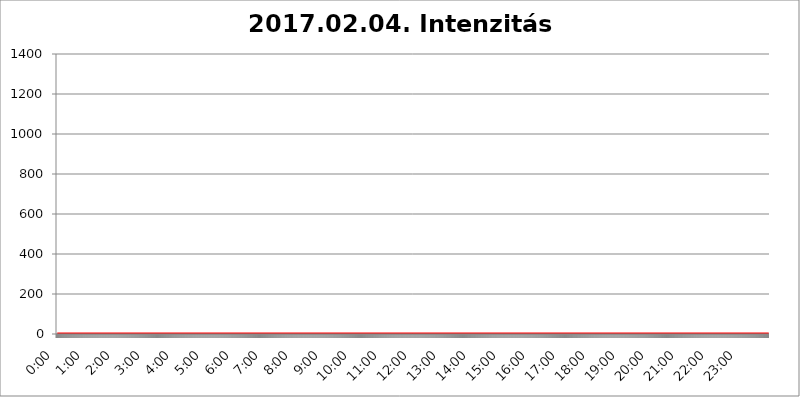
| Category | 2017.02.04. Intenzitás [W/m^2] |
|---|---|
| 0.0 | 0 |
| 0.0006944444444444445 | 0 |
| 0.001388888888888889 | 0 |
| 0.0020833333333333333 | 0 |
| 0.002777777777777778 | 0 |
| 0.003472222222222222 | 0 |
| 0.004166666666666667 | 0 |
| 0.004861111111111111 | 0 |
| 0.005555555555555556 | 0 |
| 0.0062499999999999995 | 0 |
| 0.006944444444444444 | 0 |
| 0.007638888888888889 | 0 |
| 0.008333333333333333 | 0 |
| 0.009027777777777779 | 0 |
| 0.009722222222222222 | 0 |
| 0.010416666666666666 | 0 |
| 0.011111111111111112 | 0 |
| 0.011805555555555555 | 0 |
| 0.012499999999999999 | 0 |
| 0.013194444444444444 | 0 |
| 0.013888888888888888 | 0 |
| 0.014583333333333332 | 0 |
| 0.015277777777777777 | 0 |
| 0.015972222222222224 | 0 |
| 0.016666666666666666 | 0 |
| 0.017361111111111112 | 0 |
| 0.018055555555555557 | 0 |
| 0.01875 | 0 |
| 0.019444444444444445 | 0 |
| 0.02013888888888889 | 0 |
| 0.020833333333333332 | 0 |
| 0.02152777777777778 | 0 |
| 0.022222222222222223 | 0 |
| 0.02291666666666667 | 0 |
| 0.02361111111111111 | 0 |
| 0.024305555555555556 | 0 |
| 0.024999999999999998 | 0 |
| 0.025694444444444447 | 0 |
| 0.02638888888888889 | 0 |
| 0.027083333333333334 | 0 |
| 0.027777777777777776 | 0 |
| 0.02847222222222222 | 0 |
| 0.029166666666666664 | 0 |
| 0.029861111111111113 | 0 |
| 0.030555555555555555 | 0 |
| 0.03125 | 0 |
| 0.03194444444444445 | 0 |
| 0.03263888888888889 | 0 |
| 0.03333333333333333 | 0 |
| 0.034027777777777775 | 0 |
| 0.034722222222222224 | 0 |
| 0.035416666666666666 | 0 |
| 0.036111111111111115 | 0 |
| 0.03680555555555556 | 0 |
| 0.0375 | 0 |
| 0.03819444444444444 | 0 |
| 0.03888888888888889 | 0 |
| 0.03958333333333333 | 0 |
| 0.04027777777777778 | 0 |
| 0.04097222222222222 | 0 |
| 0.041666666666666664 | 0 |
| 0.042361111111111106 | 0 |
| 0.04305555555555556 | 0 |
| 0.043750000000000004 | 0 |
| 0.044444444444444446 | 0 |
| 0.04513888888888889 | 0 |
| 0.04583333333333334 | 0 |
| 0.04652777777777778 | 0 |
| 0.04722222222222222 | 0 |
| 0.04791666666666666 | 0 |
| 0.04861111111111111 | 0 |
| 0.049305555555555554 | 0 |
| 0.049999999999999996 | 0 |
| 0.05069444444444445 | 0 |
| 0.051388888888888894 | 0 |
| 0.052083333333333336 | 0 |
| 0.05277777777777778 | 0 |
| 0.05347222222222222 | 0 |
| 0.05416666666666667 | 0 |
| 0.05486111111111111 | 0 |
| 0.05555555555555555 | 0 |
| 0.05625 | 0 |
| 0.05694444444444444 | 0 |
| 0.057638888888888885 | 0 |
| 0.05833333333333333 | 0 |
| 0.05902777777777778 | 0 |
| 0.059722222222222225 | 0 |
| 0.06041666666666667 | 0 |
| 0.061111111111111116 | 0 |
| 0.06180555555555556 | 0 |
| 0.0625 | 0 |
| 0.06319444444444444 | 0 |
| 0.06388888888888888 | 0 |
| 0.06458333333333334 | 0 |
| 0.06527777777777778 | 0 |
| 0.06597222222222222 | 0 |
| 0.06666666666666667 | 0 |
| 0.06736111111111111 | 0 |
| 0.06805555555555555 | 0 |
| 0.06874999999999999 | 0 |
| 0.06944444444444443 | 0 |
| 0.07013888888888889 | 0 |
| 0.07083333333333333 | 0 |
| 0.07152777777777779 | 0 |
| 0.07222222222222223 | 0 |
| 0.07291666666666667 | 0 |
| 0.07361111111111111 | 0 |
| 0.07430555555555556 | 0 |
| 0.075 | 0 |
| 0.07569444444444444 | 0 |
| 0.0763888888888889 | 0 |
| 0.07708333333333334 | 0 |
| 0.07777777777777778 | 0 |
| 0.07847222222222222 | 0 |
| 0.07916666666666666 | 0 |
| 0.0798611111111111 | 0 |
| 0.08055555555555556 | 0 |
| 0.08125 | 0 |
| 0.08194444444444444 | 0 |
| 0.08263888888888889 | 0 |
| 0.08333333333333333 | 0 |
| 0.08402777777777777 | 0 |
| 0.08472222222222221 | 0 |
| 0.08541666666666665 | 0 |
| 0.08611111111111112 | 0 |
| 0.08680555555555557 | 0 |
| 0.08750000000000001 | 0 |
| 0.08819444444444445 | 0 |
| 0.08888888888888889 | 0 |
| 0.08958333333333333 | 0 |
| 0.09027777777777778 | 0 |
| 0.09097222222222222 | 0 |
| 0.09166666666666667 | 0 |
| 0.09236111111111112 | 0 |
| 0.09305555555555556 | 0 |
| 0.09375 | 0 |
| 0.09444444444444444 | 0 |
| 0.09513888888888888 | 0 |
| 0.09583333333333333 | 0 |
| 0.09652777777777777 | 0 |
| 0.09722222222222222 | 0 |
| 0.09791666666666667 | 0 |
| 0.09861111111111111 | 0 |
| 0.09930555555555555 | 0 |
| 0.09999999999999999 | 0 |
| 0.10069444444444443 | 0 |
| 0.1013888888888889 | 0 |
| 0.10208333333333335 | 0 |
| 0.10277777777777779 | 0 |
| 0.10347222222222223 | 0 |
| 0.10416666666666667 | 0 |
| 0.10486111111111111 | 0 |
| 0.10555555555555556 | 0 |
| 0.10625 | 0 |
| 0.10694444444444444 | 0 |
| 0.1076388888888889 | 0 |
| 0.10833333333333334 | 0 |
| 0.10902777777777778 | 0 |
| 0.10972222222222222 | 0 |
| 0.1111111111111111 | 0 |
| 0.11180555555555556 | 0 |
| 0.11180555555555556 | 0 |
| 0.1125 | 0 |
| 0.11319444444444444 | 0 |
| 0.11388888888888889 | 0 |
| 0.11458333333333333 | 0 |
| 0.11527777777777777 | 0 |
| 0.11597222222222221 | 0 |
| 0.11666666666666665 | 0 |
| 0.1173611111111111 | 0 |
| 0.11805555555555557 | 0 |
| 0.11944444444444445 | 0 |
| 0.12013888888888889 | 0 |
| 0.12083333333333333 | 0 |
| 0.12152777777777778 | 0 |
| 0.12222222222222223 | 0 |
| 0.12291666666666667 | 0 |
| 0.12291666666666667 | 0 |
| 0.12361111111111112 | 0 |
| 0.12430555555555556 | 0 |
| 0.125 | 0 |
| 0.12569444444444444 | 0 |
| 0.12638888888888888 | 0 |
| 0.12708333333333333 | 0 |
| 0.16875 | 0 |
| 0.12847222222222224 | 0 |
| 0.12916666666666668 | 0 |
| 0.12986111111111112 | 0 |
| 0.13055555555555556 | 0 |
| 0.13125 | 0 |
| 0.13194444444444445 | 0 |
| 0.1326388888888889 | 0 |
| 0.13333333333333333 | 0 |
| 0.13402777777777777 | 0 |
| 0.13402777777777777 | 0 |
| 0.13472222222222222 | 0 |
| 0.13541666666666666 | 0 |
| 0.1361111111111111 | 0 |
| 0.13749999999999998 | 0 |
| 0.13819444444444443 | 0 |
| 0.1388888888888889 | 0 |
| 0.13958333333333334 | 0 |
| 0.14027777777777778 | 0 |
| 0.14097222222222222 | 0 |
| 0.14166666666666666 | 0 |
| 0.1423611111111111 | 0 |
| 0.14305555555555557 | 0 |
| 0.14375000000000002 | 0 |
| 0.14444444444444446 | 0 |
| 0.1451388888888889 | 0 |
| 0.1451388888888889 | 0 |
| 0.14652777777777778 | 0 |
| 0.14722222222222223 | 0 |
| 0.14791666666666667 | 0 |
| 0.1486111111111111 | 0 |
| 0.14930555555555555 | 0 |
| 0.15 | 0 |
| 0.15069444444444444 | 0 |
| 0.15138888888888888 | 0 |
| 0.15208333333333332 | 0 |
| 0.15277777777777776 | 0 |
| 0.15347222222222223 | 0 |
| 0.15416666666666667 | 0 |
| 0.15486111111111112 | 0 |
| 0.15555555555555556 | 0 |
| 0.15625 | 0 |
| 0.15694444444444444 | 0 |
| 0.15763888888888888 | 0 |
| 0.15833333333333333 | 0 |
| 0.15902777777777777 | 0 |
| 0.15972222222222224 | 0 |
| 0.16041666666666668 | 0 |
| 0.16111111111111112 | 0 |
| 0.16180555555555556 | 0 |
| 0.1625 | 0 |
| 0.16319444444444445 | 0 |
| 0.1638888888888889 | 0 |
| 0.16458333333333333 | 0 |
| 0.16527777777777777 | 0 |
| 0.16597222222222222 | 0 |
| 0.16666666666666666 | 0 |
| 0.1673611111111111 | 0 |
| 0.16805555555555554 | 0 |
| 0.16874999999999998 | 0 |
| 0.16944444444444443 | 0 |
| 0.17013888888888887 | 0 |
| 0.1708333333333333 | 0 |
| 0.17152777777777775 | 0 |
| 0.17222222222222225 | 0 |
| 0.1729166666666667 | 0 |
| 0.17361111111111113 | 0 |
| 0.17430555555555557 | 0 |
| 0.17500000000000002 | 0 |
| 0.17569444444444446 | 0 |
| 0.1763888888888889 | 0 |
| 0.17708333333333334 | 0 |
| 0.17777777777777778 | 0 |
| 0.17847222222222223 | 0 |
| 0.17916666666666667 | 0 |
| 0.1798611111111111 | 0 |
| 0.18055555555555555 | 0 |
| 0.18125 | 0 |
| 0.18194444444444444 | 0 |
| 0.1826388888888889 | 0 |
| 0.18333333333333335 | 0 |
| 0.1840277777777778 | 0 |
| 0.18472222222222223 | 0 |
| 0.18541666666666667 | 0 |
| 0.18611111111111112 | 0 |
| 0.18680555555555556 | 0 |
| 0.1875 | 0 |
| 0.18819444444444444 | 0 |
| 0.18888888888888888 | 0 |
| 0.18958333333333333 | 0 |
| 0.19027777777777777 | 0 |
| 0.1909722222222222 | 0 |
| 0.19166666666666665 | 0 |
| 0.19236111111111112 | 0 |
| 0.19305555555555554 | 0 |
| 0.19375 | 0 |
| 0.19444444444444445 | 0 |
| 0.1951388888888889 | 0 |
| 0.19583333333333333 | 0 |
| 0.19652777777777777 | 0 |
| 0.19722222222222222 | 0 |
| 0.19791666666666666 | 0 |
| 0.1986111111111111 | 0 |
| 0.19930555555555554 | 0 |
| 0.19999999999999998 | 0 |
| 0.20069444444444443 | 0 |
| 0.20138888888888887 | 0 |
| 0.2020833333333333 | 0 |
| 0.2027777777777778 | 0 |
| 0.2034722222222222 | 0 |
| 0.2041666666666667 | 0 |
| 0.20486111111111113 | 0 |
| 0.20555555555555557 | 0 |
| 0.20625000000000002 | 0 |
| 0.20694444444444446 | 0 |
| 0.2076388888888889 | 0 |
| 0.20833333333333334 | 0 |
| 0.20902777777777778 | 0 |
| 0.20972222222222223 | 0 |
| 0.21041666666666667 | 0 |
| 0.2111111111111111 | 0 |
| 0.21180555555555555 | 0 |
| 0.2125 | 0 |
| 0.21319444444444444 | 0 |
| 0.2138888888888889 | 0 |
| 0.21458333333333335 | 0 |
| 0.2152777777777778 | 0 |
| 0.21597222222222223 | 0 |
| 0.21666666666666667 | 0 |
| 0.21736111111111112 | 0 |
| 0.21805555555555556 | 0 |
| 0.21875 | 0 |
| 0.21944444444444444 | 0 |
| 0.22013888888888888 | 0 |
| 0.22083333333333333 | 0 |
| 0.22152777777777777 | 0 |
| 0.2222222222222222 | 0 |
| 0.22291666666666665 | 0 |
| 0.2236111111111111 | 0 |
| 0.22430555555555556 | 0 |
| 0.225 | 0 |
| 0.22569444444444445 | 0 |
| 0.2263888888888889 | 0 |
| 0.22708333333333333 | 0 |
| 0.22777777777777777 | 0 |
| 0.22847222222222222 | 0 |
| 0.22916666666666666 | 0 |
| 0.2298611111111111 | 0 |
| 0.23055555555555554 | 0 |
| 0.23124999999999998 | 0 |
| 0.23194444444444443 | 0 |
| 0.23263888888888887 | 0 |
| 0.2333333333333333 | 0 |
| 0.2340277777777778 | 0 |
| 0.2347222222222222 | 0 |
| 0.2354166666666667 | 0 |
| 0.23611111111111113 | 0 |
| 0.23680555555555557 | 0 |
| 0.23750000000000002 | 0 |
| 0.23819444444444446 | 0 |
| 0.2388888888888889 | 0 |
| 0.23958333333333334 | 0 |
| 0.24027777777777778 | 0 |
| 0.24097222222222223 | 0 |
| 0.24166666666666667 | 0 |
| 0.2423611111111111 | 0 |
| 0.24305555555555555 | 0 |
| 0.24375 | 0 |
| 0.24444444444444446 | 0 |
| 0.24513888888888888 | 0 |
| 0.24583333333333335 | 0 |
| 0.2465277777777778 | 0 |
| 0.24722222222222223 | 0 |
| 0.24791666666666667 | 0 |
| 0.24861111111111112 | 0 |
| 0.24930555555555556 | 0 |
| 0.25 | 0 |
| 0.25069444444444444 | 0 |
| 0.2513888888888889 | 0 |
| 0.2520833333333333 | 0 |
| 0.25277777777777777 | 0 |
| 0.2534722222222222 | 0 |
| 0.25416666666666665 | 0 |
| 0.2548611111111111 | 0 |
| 0.2555555555555556 | 0 |
| 0.25625000000000003 | 0 |
| 0.2569444444444445 | 0 |
| 0.2576388888888889 | 0 |
| 0.25833333333333336 | 0 |
| 0.2590277777777778 | 0 |
| 0.25972222222222224 | 0 |
| 0.2604166666666667 | 0 |
| 0.2611111111111111 | 0 |
| 0.26180555555555557 | 0 |
| 0.2625 | 0 |
| 0.26319444444444445 | 0 |
| 0.2638888888888889 | 0 |
| 0.26458333333333334 | 0 |
| 0.2652777777777778 | 0 |
| 0.2659722222222222 | 0 |
| 0.26666666666666666 | 0 |
| 0.2673611111111111 | 0 |
| 0.26805555555555555 | 0 |
| 0.26875 | 0 |
| 0.26944444444444443 | 0 |
| 0.2701388888888889 | 0 |
| 0.2708333333333333 | 0 |
| 0.27152777777777776 | 0 |
| 0.2722222222222222 | 0 |
| 0.27291666666666664 | 0 |
| 0.2736111111111111 | 0 |
| 0.2743055555555555 | 0 |
| 0.27499999999999997 | 0 |
| 0.27569444444444446 | 0 |
| 0.27638888888888885 | 0 |
| 0.27708333333333335 | 0 |
| 0.2777777777777778 | 0 |
| 0.27847222222222223 | 0 |
| 0.2791666666666667 | 0 |
| 0.2798611111111111 | 0 |
| 0.28055555555555556 | 0 |
| 0.28125 | 0 |
| 0.28194444444444444 | 0 |
| 0.2826388888888889 | 0 |
| 0.2833333333333333 | 0 |
| 0.28402777777777777 | 0 |
| 0.2847222222222222 | 0 |
| 0.28541666666666665 | 0 |
| 0.28611111111111115 | 0 |
| 0.28680555555555554 | 0 |
| 0.28750000000000003 | 0 |
| 0.2881944444444445 | 0 |
| 0.2888888888888889 | 0 |
| 0.28958333333333336 | 0 |
| 0.2902777777777778 | 0 |
| 0.29097222222222224 | 0 |
| 0.2916666666666667 | 0 |
| 0.2923611111111111 | 0 |
| 0.29305555555555557 | 0 |
| 0.29375 | 0 |
| 0.29444444444444445 | 0 |
| 0.2951388888888889 | 0 |
| 0.29583333333333334 | 0 |
| 0.2965277777777778 | 0 |
| 0.2972222222222222 | 0 |
| 0.29791666666666666 | 0 |
| 0.2986111111111111 | 0 |
| 0.29930555555555555 | 0 |
| 0.3 | 0 |
| 0.30069444444444443 | 0 |
| 0.3013888888888889 | 0 |
| 0.3020833333333333 | 0 |
| 0.30277777777777776 | 0 |
| 0.3034722222222222 | 0 |
| 0.30416666666666664 | 0 |
| 0.3048611111111111 | 0 |
| 0.3055555555555555 | 0 |
| 0.30624999999999997 | 0 |
| 0.3069444444444444 | 0 |
| 0.3076388888888889 | 0 |
| 0.30833333333333335 | 0 |
| 0.3090277777777778 | 0 |
| 0.30972222222222223 | 0 |
| 0.3104166666666667 | 0 |
| 0.3111111111111111 | 0 |
| 0.31180555555555556 | 0 |
| 0.3125 | 0 |
| 0.31319444444444444 | 0 |
| 0.3138888888888889 | 0 |
| 0.3145833333333333 | 0 |
| 0.31527777777777777 | 0 |
| 0.3159722222222222 | 0 |
| 0.31666666666666665 | 0 |
| 0.31736111111111115 | 0 |
| 0.31805555555555554 | 0 |
| 0.31875000000000003 | 0 |
| 0.3194444444444445 | 0 |
| 0.3201388888888889 | 0 |
| 0.32083333333333336 | 0 |
| 0.3215277777777778 | 0 |
| 0.32222222222222224 | 0 |
| 0.3229166666666667 | 0 |
| 0.3236111111111111 | 0 |
| 0.32430555555555557 | 0 |
| 0.325 | 0 |
| 0.32569444444444445 | 0 |
| 0.3263888888888889 | 0 |
| 0.32708333333333334 | 0 |
| 0.3277777777777778 | 0 |
| 0.3284722222222222 | 0 |
| 0.32916666666666666 | 0 |
| 0.3298611111111111 | 0 |
| 0.33055555555555555 | 0 |
| 0.33125 | 0 |
| 0.33194444444444443 | 0 |
| 0.3326388888888889 | 0 |
| 0.3333333333333333 | 0 |
| 0.3340277777777778 | 0 |
| 0.3347222222222222 | 0 |
| 0.3354166666666667 | 0 |
| 0.3361111111111111 | 0 |
| 0.3368055555555556 | 0 |
| 0.33749999999999997 | 0 |
| 0.33819444444444446 | 0 |
| 0.33888888888888885 | 0 |
| 0.33958333333333335 | 0 |
| 0.34027777777777773 | 0 |
| 0.34097222222222223 | 0 |
| 0.3416666666666666 | 0 |
| 0.3423611111111111 | 0 |
| 0.3430555555555555 | 0 |
| 0.34375 | 0 |
| 0.3444444444444445 | 0 |
| 0.3451388888888889 | 0 |
| 0.3458333333333334 | 0 |
| 0.34652777777777777 | 0 |
| 0.34722222222222227 | 0 |
| 0.34791666666666665 | 0 |
| 0.34861111111111115 | 0 |
| 0.34930555555555554 | 0 |
| 0.35000000000000003 | 0 |
| 0.3506944444444444 | 0 |
| 0.3513888888888889 | 0 |
| 0.3520833333333333 | 0 |
| 0.3527777777777778 | 0 |
| 0.3534722222222222 | 0 |
| 0.3541666666666667 | 0 |
| 0.3548611111111111 | 0 |
| 0.35555555555555557 | 0 |
| 0.35625 | 0 |
| 0.35694444444444445 | 0 |
| 0.3576388888888889 | 0 |
| 0.35833333333333334 | 0 |
| 0.3590277777777778 | 0 |
| 0.3597222222222222 | 0 |
| 0.36041666666666666 | 0 |
| 0.3611111111111111 | 0 |
| 0.36180555555555555 | 0 |
| 0.3625 | 0 |
| 0.36319444444444443 | 0 |
| 0.3638888888888889 | 0 |
| 0.3645833333333333 | 0 |
| 0.3652777777777778 | 0 |
| 0.3659722222222222 | 0 |
| 0.3666666666666667 | 0 |
| 0.3673611111111111 | 0 |
| 0.3680555555555556 | 0 |
| 0.36874999999999997 | 0 |
| 0.36944444444444446 | 0 |
| 0.37013888888888885 | 0 |
| 0.37083333333333335 | 0 |
| 0.37152777777777773 | 0 |
| 0.37222222222222223 | 0 |
| 0.3729166666666666 | 0 |
| 0.3736111111111111 | 0 |
| 0.3743055555555555 | 0 |
| 0.375 | 0 |
| 0.3756944444444445 | 0 |
| 0.3763888888888889 | 0 |
| 0.3770833333333334 | 0 |
| 0.37777777777777777 | 0 |
| 0.37847222222222227 | 0 |
| 0.37916666666666665 | 0 |
| 0.37986111111111115 | 0 |
| 0.38055555555555554 | 0 |
| 0.38125000000000003 | 0 |
| 0.3819444444444444 | 0 |
| 0.3826388888888889 | 0 |
| 0.3833333333333333 | 0 |
| 0.3840277777777778 | 0 |
| 0.3847222222222222 | 0 |
| 0.3854166666666667 | 0 |
| 0.3861111111111111 | 0 |
| 0.38680555555555557 | 0 |
| 0.3875 | 0 |
| 0.38819444444444445 | 0 |
| 0.3888888888888889 | 0 |
| 0.38958333333333334 | 0 |
| 0.3902777777777778 | 0 |
| 0.3909722222222222 | 0 |
| 0.39166666666666666 | 0 |
| 0.3923611111111111 | 0 |
| 0.39305555555555555 | 0 |
| 0.39375 | 0 |
| 0.39444444444444443 | 0 |
| 0.3951388888888889 | 0 |
| 0.3958333333333333 | 0 |
| 0.3965277777777778 | 0 |
| 0.3972222222222222 | 0 |
| 0.3979166666666667 | 0 |
| 0.3986111111111111 | 0 |
| 0.3993055555555556 | 0 |
| 0.39999999999999997 | 0 |
| 0.40069444444444446 | 0 |
| 0.40138888888888885 | 0 |
| 0.40208333333333335 | 0 |
| 0.40277777777777773 | 0 |
| 0.40347222222222223 | 0 |
| 0.4041666666666666 | 0 |
| 0.4048611111111111 | 0 |
| 0.4055555555555555 | 0 |
| 0.40625 | 0 |
| 0.4069444444444445 | 0 |
| 0.4076388888888889 | 0 |
| 0.4083333333333334 | 0 |
| 0.40902777777777777 | 0 |
| 0.40972222222222227 | 0 |
| 0.41041666666666665 | 0 |
| 0.41111111111111115 | 0 |
| 0.41180555555555554 | 0 |
| 0.41250000000000003 | 0 |
| 0.4131944444444444 | 0 |
| 0.4138888888888889 | 0 |
| 0.4145833333333333 | 0 |
| 0.4152777777777778 | 0 |
| 0.4159722222222222 | 0 |
| 0.4166666666666667 | 0 |
| 0.4173611111111111 | 0 |
| 0.41805555555555557 | 0 |
| 0.41875 | 0 |
| 0.41944444444444445 | 0 |
| 0.4201388888888889 | 0 |
| 0.42083333333333334 | 0 |
| 0.4215277777777778 | 0 |
| 0.4222222222222222 | 0 |
| 0.42291666666666666 | 0 |
| 0.4236111111111111 | 0 |
| 0.42430555555555555 | 0 |
| 0.425 | 0 |
| 0.42569444444444443 | 0 |
| 0.4263888888888889 | 0 |
| 0.4270833333333333 | 0 |
| 0.4277777777777778 | 0 |
| 0.4284722222222222 | 0 |
| 0.4291666666666667 | 0 |
| 0.4298611111111111 | 0 |
| 0.4305555555555556 | 0 |
| 0.43124999999999997 | 0 |
| 0.43194444444444446 | 0 |
| 0.43263888888888885 | 0 |
| 0.43333333333333335 | 0 |
| 0.43402777777777773 | 0 |
| 0.43472222222222223 | 0 |
| 0.4354166666666666 | 0 |
| 0.4361111111111111 | 0 |
| 0.4368055555555555 | 0 |
| 0.4375 | 0 |
| 0.4381944444444445 | 0 |
| 0.4388888888888889 | 0 |
| 0.4395833333333334 | 0 |
| 0.44027777777777777 | 0 |
| 0.44097222222222227 | 0 |
| 0.44166666666666665 | 0 |
| 0.44236111111111115 | 0 |
| 0.44305555555555554 | 0 |
| 0.44375000000000003 | 0 |
| 0.4444444444444444 | 0 |
| 0.4451388888888889 | 0 |
| 0.4458333333333333 | 0 |
| 0.4465277777777778 | 0 |
| 0.4472222222222222 | 0 |
| 0.4479166666666667 | 0 |
| 0.4486111111111111 | 0 |
| 0.44930555555555557 | 0 |
| 0.45 | 0 |
| 0.45069444444444445 | 0 |
| 0.4513888888888889 | 0 |
| 0.45208333333333334 | 0 |
| 0.4527777777777778 | 0 |
| 0.4534722222222222 | 0 |
| 0.45416666666666666 | 0 |
| 0.4548611111111111 | 0 |
| 0.45555555555555555 | 0 |
| 0.45625 | 0 |
| 0.45694444444444443 | 0 |
| 0.4576388888888889 | 0 |
| 0.4583333333333333 | 0 |
| 0.4590277777777778 | 0 |
| 0.4597222222222222 | 0 |
| 0.4604166666666667 | 0 |
| 0.4611111111111111 | 0 |
| 0.4618055555555556 | 0 |
| 0.46249999999999997 | 0 |
| 0.46319444444444446 | 0 |
| 0.46388888888888885 | 0 |
| 0.46458333333333335 | 0 |
| 0.46527777777777773 | 0 |
| 0.46597222222222223 | 0 |
| 0.4666666666666666 | 0 |
| 0.4673611111111111 | 0 |
| 0.4680555555555555 | 0 |
| 0.46875 | 0 |
| 0.4694444444444445 | 0 |
| 0.4701388888888889 | 0 |
| 0.4708333333333334 | 0 |
| 0.47152777777777777 | 0 |
| 0.47222222222222227 | 0 |
| 0.47291666666666665 | 0 |
| 0.47361111111111115 | 0 |
| 0.47430555555555554 | 0 |
| 0.47500000000000003 | 0 |
| 0.4756944444444444 | 0 |
| 0.4763888888888889 | 0 |
| 0.4770833333333333 | 0 |
| 0.4777777777777778 | 0 |
| 0.4784722222222222 | 0 |
| 0.4791666666666667 | 0 |
| 0.4798611111111111 | 0 |
| 0.48055555555555557 | 0 |
| 0.48125 | 0 |
| 0.48194444444444445 | 0 |
| 0.4826388888888889 | 0 |
| 0.48333333333333334 | 0 |
| 0.4840277777777778 | 0 |
| 0.4847222222222222 | 0 |
| 0.48541666666666666 | 0 |
| 0.4861111111111111 | 0 |
| 0.48680555555555555 | 0 |
| 0.4875 | 0 |
| 0.48819444444444443 | 0 |
| 0.4888888888888889 | 0 |
| 0.4895833333333333 | 0 |
| 0.4902777777777778 | 0 |
| 0.4909722222222222 | 0 |
| 0.4916666666666667 | 0 |
| 0.4923611111111111 | 0 |
| 0.4930555555555556 | 0 |
| 0.49374999999999997 | 0 |
| 0.49444444444444446 | 0 |
| 0.49513888888888885 | 0 |
| 0.49583333333333335 | 0 |
| 0.49652777777777773 | 0 |
| 0.49722222222222223 | 0 |
| 0.4979166666666666 | 0 |
| 0.4986111111111111 | 0 |
| 0.4993055555555555 | 0 |
| 0.5 | 0 |
| 0.5006944444444444 | 0 |
| 0.5013888888888889 | 0 |
| 0.5020833333333333 | 0 |
| 0.5027777777777778 | 0 |
| 0.5034722222222222 | 0 |
| 0.5041666666666667 | 0 |
| 0.5048611111111111 | 0 |
| 0.5055555555555555 | 0 |
| 0.50625 | 0 |
| 0.5069444444444444 | 0 |
| 0.5076388888888889 | 0 |
| 0.5083333333333333 | 0 |
| 0.5090277777777777 | 0 |
| 0.5097222222222222 | 0 |
| 0.5104166666666666 | 0 |
| 0.5111111111111112 | 0 |
| 0.5118055555555555 | 0 |
| 0.5125000000000001 | 0 |
| 0.5131944444444444 | 0 |
| 0.513888888888889 | 0 |
| 0.5145833333333333 | 0 |
| 0.5152777777777778 | 0 |
| 0.5159722222222222 | 0 |
| 0.5166666666666667 | 0 |
| 0.517361111111111 | 0 |
| 0.5180555555555556 | 0 |
| 0.5187499999999999 | 0 |
| 0.5194444444444445 | 0 |
| 0.5201388888888888 | 0 |
| 0.5208333333333334 | 0 |
| 0.5215277777777778 | 0 |
| 0.5222222222222223 | 0 |
| 0.5229166666666667 | 0 |
| 0.5236111111111111 | 0 |
| 0.5243055555555556 | 0 |
| 0.525 | 0 |
| 0.5256944444444445 | 0 |
| 0.5263888888888889 | 0 |
| 0.5270833333333333 | 0 |
| 0.5277777777777778 | 0 |
| 0.5284722222222222 | 0 |
| 0.5291666666666667 | 0 |
| 0.5298611111111111 | 0 |
| 0.5305555555555556 | 0 |
| 0.53125 | 0 |
| 0.5319444444444444 | 0 |
| 0.5326388888888889 | 0 |
| 0.5333333333333333 | 0 |
| 0.5340277777777778 | 0 |
| 0.5347222222222222 | 0 |
| 0.5354166666666667 | 0 |
| 0.5361111111111111 | 0 |
| 0.5368055555555555 | 0 |
| 0.5375 | 0 |
| 0.5381944444444444 | 0 |
| 0.5388888888888889 | 0 |
| 0.5395833333333333 | 0 |
| 0.5402777777777777 | 0 |
| 0.5409722222222222 | 0 |
| 0.5416666666666666 | 0 |
| 0.5423611111111112 | 0 |
| 0.5430555555555555 | 0 |
| 0.5437500000000001 | 0 |
| 0.5444444444444444 | 0 |
| 0.545138888888889 | 0 |
| 0.5458333333333333 | 0 |
| 0.5465277777777778 | 0 |
| 0.5472222222222222 | 0 |
| 0.5479166666666667 | 0 |
| 0.548611111111111 | 0 |
| 0.5493055555555556 | 0 |
| 0.5499999999999999 | 0 |
| 0.5506944444444445 | 0 |
| 0.5513888888888888 | 0 |
| 0.5520833333333334 | 0 |
| 0.5527777777777778 | 0 |
| 0.5534722222222223 | 0 |
| 0.5541666666666667 | 0 |
| 0.5548611111111111 | 0 |
| 0.5555555555555556 | 0 |
| 0.55625 | 0 |
| 0.5569444444444445 | 0 |
| 0.5576388888888889 | 0 |
| 0.5583333333333333 | 0 |
| 0.5590277777777778 | 0 |
| 0.5597222222222222 | 0 |
| 0.5604166666666667 | 0 |
| 0.5611111111111111 | 0 |
| 0.5618055555555556 | 0 |
| 0.5625 | 0 |
| 0.5631944444444444 | 0 |
| 0.5638888888888889 | 0 |
| 0.5645833333333333 | 0 |
| 0.5652777777777778 | 0 |
| 0.5659722222222222 | 0 |
| 0.5666666666666667 | 0 |
| 0.5673611111111111 | 0 |
| 0.5680555555555555 | 0 |
| 0.56875 | 0 |
| 0.5694444444444444 | 0 |
| 0.5701388888888889 | 0 |
| 0.5708333333333333 | 0 |
| 0.5715277777777777 | 0 |
| 0.5722222222222222 | 0 |
| 0.5729166666666666 | 0 |
| 0.5736111111111112 | 0 |
| 0.5743055555555555 | 0 |
| 0.5750000000000001 | 0 |
| 0.5756944444444444 | 0 |
| 0.576388888888889 | 0 |
| 0.5770833333333333 | 0 |
| 0.5777777777777778 | 0 |
| 0.5784722222222222 | 0 |
| 0.5791666666666667 | 0 |
| 0.579861111111111 | 0 |
| 0.5805555555555556 | 0 |
| 0.5812499999999999 | 0 |
| 0.5819444444444445 | 0 |
| 0.5826388888888888 | 0 |
| 0.5833333333333334 | 0 |
| 0.5840277777777778 | 0 |
| 0.5847222222222223 | 0 |
| 0.5854166666666667 | 0 |
| 0.5861111111111111 | 0 |
| 0.5868055555555556 | 0 |
| 0.5875 | 0 |
| 0.5881944444444445 | 0 |
| 0.5888888888888889 | 0 |
| 0.5895833333333333 | 0 |
| 0.5902777777777778 | 0 |
| 0.5909722222222222 | 0 |
| 0.5916666666666667 | 0 |
| 0.5923611111111111 | 0 |
| 0.5930555555555556 | 0 |
| 0.59375 | 0 |
| 0.5944444444444444 | 0 |
| 0.5951388888888889 | 0 |
| 0.5958333333333333 | 0 |
| 0.5965277777777778 | 0 |
| 0.5972222222222222 | 0 |
| 0.5979166666666667 | 0 |
| 0.5986111111111111 | 0 |
| 0.5993055555555555 | 0 |
| 0.6 | 0 |
| 0.6006944444444444 | 0 |
| 0.6013888888888889 | 0 |
| 0.6020833333333333 | 0 |
| 0.6027777777777777 | 0 |
| 0.6034722222222222 | 0 |
| 0.6041666666666666 | 0 |
| 0.6048611111111112 | 0 |
| 0.6055555555555555 | 0 |
| 0.6062500000000001 | 0 |
| 0.6069444444444444 | 0 |
| 0.607638888888889 | 0 |
| 0.6083333333333333 | 0 |
| 0.6090277777777778 | 0 |
| 0.6097222222222222 | 0 |
| 0.6104166666666667 | 0 |
| 0.611111111111111 | 0 |
| 0.6118055555555556 | 0 |
| 0.6124999999999999 | 0 |
| 0.6131944444444445 | 0 |
| 0.6138888888888888 | 0 |
| 0.6145833333333334 | 0 |
| 0.6152777777777778 | 0 |
| 0.6159722222222223 | 0 |
| 0.6166666666666667 | 0 |
| 0.6173611111111111 | 0 |
| 0.6180555555555556 | 0 |
| 0.61875 | 0 |
| 0.6194444444444445 | 0 |
| 0.6201388888888889 | 0 |
| 0.6208333333333333 | 0 |
| 0.6215277777777778 | 0 |
| 0.6222222222222222 | 0 |
| 0.6229166666666667 | 0 |
| 0.6236111111111111 | 0 |
| 0.6243055555555556 | 0 |
| 0.625 | 0 |
| 0.6256944444444444 | 0 |
| 0.6263888888888889 | 0 |
| 0.6270833333333333 | 0 |
| 0.6277777777777778 | 0 |
| 0.6284722222222222 | 0 |
| 0.6291666666666667 | 0 |
| 0.6298611111111111 | 0 |
| 0.6305555555555555 | 0 |
| 0.63125 | 0 |
| 0.6319444444444444 | 0 |
| 0.6326388888888889 | 0 |
| 0.6333333333333333 | 0 |
| 0.6340277777777777 | 0 |
| 0.6347222222222222 | 0 |
| 0.6354166666666666 | 0 |
| 0.6361111111111112 | 0 |
| 0.6368055555555555 | 0 |
| 0.6375000000000001 | 0 |
| 0.6381944444444444 | 0 |
| 0.638888888888889 | 0 |
| 0.6395833333333333 | 0 |
| 0.6402777777777778 | 0 |
| 0.6409722222222222 | 0 |
| 0.6416666666666667 | 0 |
| 0.642361111111111 | 0 |
| 0.6430555555555556 | 0 |
| 0.6437499999999999 | 0 |
| 0.6444444444444445 | 0 |
| 0.6451388888888888 | 0 |
| 0.6458333333333334 | 0 |
| 0.6465277777777778 | 0 |
| 0.6472222222222223 | 0 |
| 0.6479166666666667 | 0 |
| 0.6486111111111111 | 0 |
| 0.6493055555555556 | 0 |
| 0.65 | 0 |
| 0.6506944444444445 | 0 |
| 0.6513888888888889 | 0 |
| 0.6520833333333333 | 0 |
| 0.6527777777777778 | 0 |
| 0.6534722222222222 | 0 |
| 0.6541666666666667 | 0 |
| 0.6548611111111111 | 0 |
| 0.6555555555555556 | 0 |
| 0.65625 | 0 |
| 0.6569444444444444 | 0 |
| 0.6576388888888889 | 0 |
| 0.6583333333333333 | 0 |
| 0.6590277777777778 | 0 |
| 0.6597222222222222 | 0 |
| 0.6604166666666667 | 0 |
| 0.6611111111111111 | 0 |
| 0.6618055555555555 | 0 |
| 0.6625 | 0 |
| 0.6631944444444444 | 0 |
| 0.6638888888888889 | 0 |
| 0.6645833333333333 | 0 |
| 0.6652777777777777 | 0 |
| 0.6659722222222222 | 0 |
| 0.6666666666666666 | 0 |
| 0.6673611111111111 | 0 |
| 0.6680555555555556 | 0 |
| 0.6687500000000001 | 0 |
| 0.6694444444444444 | 0 |
| 0.6701388888888888 | 0 |
| 0.6708333333333334 | 0 |
| 0.6715277777777778 | 0 |
| 0.6722222222222222 | 0 |
| 0.6729166666666666 | 0 |
| 0.6736111111111112 | 0 |
| 0.6743055555555556 | 0 |
| 0.6749999999999999 | 0 |
| 0.6756944444444444 | 0 |
| 0.6763888888888889 | 0 |
| 0.6770833333333334 | 0 |
| 0.6777777777777777 | 0 |
| 0.6784722222222223 | 0 |
| 0.6791666666666667 | 0 |
| 0.6798611111111111 | 0 |
| 0.6805555555555555 | 0 |
| 0.68125 | 0 |
| 0.6819444444444445 | 0 |
| 0.6826388888888889 | 0 |
| 0.6833333333333332 | 0 |
| 0.6840277777777778 | 0 |
| 0.6847222222222222 | 0 |
| 0.6854166666666667 | 0 |
| 0.686111111111111 | 0 |
| 0.6868055555555556 | 0 |
| 0.6875 | 0 |
| 0.6881944444444444 | 0 |
| 0.688888888888889 | 0 |
| 0.6895833333333333 | 0 |
| 0.6902777777777778 | 0 |
| 0.6909722222222222 | 0 |
| 0.6916666666666668 | 0 |
| 0.6923611111111111 | 0 |
| 0.6930555555555555 | 0 |
| 0.69375 | 0 |
| 0.6944444444444445 | 0 |
| 0.6951388888888889 | 0 |
| 0.6958333333333333 | 0 |
| 0.6965277777777777 | 0 |
| 0.6972222222222223 | 0 |
| 0.6979166666666666 | 0 |
| 0.6986111111111111 | 0 |
| 0.6993055555555556 | 0 |
| 0.7000000000000001 | 0 |
| 0.7006944444444444 | 0 |
| 0.7013888888888888 | 0 |
| 0.7020833333333334 | 0 |
| 0.7027777777777778 | 0 |
| 0.7034722222222222 | 0 |
| 0.7041666666666666 | 0 |
| 0.7048611111111112 | 0 |
| 0.7055555555555556 | 0 |
| 0.7062499999999999 | 0 |
| 0.7069444444444444 | 0 |
| 0.7076388888888889 | 0 |
| 0.7083333333333334 | 0 |
| 0.7090277777777777 | 0 |
| 0.7097222222222223 | 0 |
| 0.7104166666666667 | 0 |
| 0.7111111111111111 | 0 |
| 0.7118055555555555 | 0 |
| 0.7125 | 0 |
| 0.7131944444444445 | 0 |
| 0.7138888888888889 | 0 |
| 0.7145833333333332 | 0 |
| 0.7152777777777778 | 0 |
| 0.7159722222222222 | 0 |
| 0.7166666666666667 | 0 |
| 0.717361111111111 | 0 |
| 0.7180555555555556 | 0 |
| 0.71875 | 0 |
| 0.7194444444444444 | 0 |
| 0.720138888888889 | 0 |
| 0.7208333333333333 | 0 |
| 0.7215277777777778 | 0 |
| 0.7222222222222222 | 0 |
| 0.7229166666666668 | 0 |
| 0.7236111111111111 | 0 |
| 0.7243055555555555 | 0 |
| 0.725 | 0 |
| 0.7256944444444445 | 0 |
| 0.7263888888888889 | 0 |
| 0.7270833333333333 | 0 |
| 0.7277777777777777 | 0 |
| 0.7284722222222223 | 0 |
| 0.7291666666666666 | 0 |
| 0.7298611111111111 | 0 |
| 0.7305555555555556 | 0 |
| 0.7312500000000001 | 0 |
| 0.7319444444444444 | 0 |
| 0.7326388888888888 | 0 |
| 0.7333333333333334 | 0 |
| 0.7340277777777778 | 0 |
| 0.7347222222222222 | 0 |
| 0.7354166666666666 | 0 |
| 0.7361111111111112 | 0 |
| 0.7368055555555556 | 0 |
| 0.7374999999999999 | 0 |
| 0.7381944444444444 | 0 |
| 0.7388888888888889 | 0 |
| 0.7395833333333334 | 0 |
| 0.7402777777777777 | 0 |
| 0.7409722222222223 | 0 |
| 0.7416666666666667 | 0 |
| 0.7423611111111111 | 0 |
| 0.7430555555555555 | 0 |
| 0.74375 | 0 |
| 0.7444444444444445 | 0 |
| 0.7451388888888889 | 0 |
| 0.7458333333333332 | 0 |
| 0.7465277777777778 | 0 |
| 0.7472222222222222 | 0 |
| 0.7479166666666667 | 0 |
| 0.748611111111111 | 0 |
| 0.7493055555555556 | 0 |
| 0.75 | 0 |
| 0.7506944444444444 | 0 |
| 0.751388888888889 | 0 |
| 0.7520833333333333 | 0 |
| 0.7527777777777778 | 0 |
| 0.7534722222222222 | 0 |
| 0.7541666666666668 | 0 |
| 0.7548611111111111 | 0 |
| 0.7555555555555555 | 0 |
| 0.75625 | 0 |
| 0.7569444444444445 | 0 |
| 0.7576388888888889 | 0 |
| 0.7583333333333333 | 0 |
| 0.7590277777777777 | 0 |
| 0.7597222222222223 | 0 |
| 0.7604166666666666 | 0 |
| 0.7611111111111111 | 0 |
| 0.7618055555555556 | 0 |
| 0.7625000000000001 | 0 |
| 0.7631944444444444 | 0 |
| 0.7638888888888888 | 0 |
| 0.7645833333333334 | 0 |
| 0.7652777777777778 | 0 |
| 0.7659722222222222 | 0 |
| 0.7666666666666666 | 0 |
| 0.7673611111111112 | 0 |
| 0.7680555555555556 | 0 |
| 0.7687499999999999 | 0 |
| 0.7694444444444444 | 0 |
| 0.7701388888888889 | 0 |
| 0.7708333333333334 | 0 |
| 0.7715277777777777 | 0 |
| 0.7722222222222223 | 0 |
| 0.7729166666666667 | 0 |
| 0.7736111111111111 | 0 |
| 0.7743055555555555 | 0 |
| 0.775 | 0 |
| 0.7756944444444445 | 0 |
| 0.7763888888888889 | 0 |
| 0.7770833333333332 | 0 |
| 0.7777777777777778 | 0 |
| 0.7784722222222222 | 0 |
| 0.7791666666666667 | 0 |
| 0.779861111111111 | 0 |
| 0.7805555555555556 | 0 |
| 0.78125 | 0 |
| 0.7819444444444444 | 0 |
| 0.782638888888889 | 0 |
| 0.7833333333333333 | 0 |
| 0.7840277777777778 | 0 |
| 0.7847222222222222 | 0 |
| 0.7854166666666668 | 0 |
| 0.7861111111111111 | 0 |
| 0.7868055555555555 | 0 |
| 0.7875 | 0 |
| 0.7881944444444445 | 0 |
| 0.7888888888888889 | 0 |
| 0.7895833333333333 | 0 |
| 0.7902777777777777 | 0 |
| 0.7909722222222223 | 0 |
| 0.7916666666666666 | 0 |
| 0.7923611111111111 | 0 |
| 0.7930555555555556 | 0 |
| 0.7937500000000001 | 0 |
| 0.7944444444444444 | 0 |
| 0.7951388888888888 | 0 |
| 0.7958333333333334 | 0 |
| 0.7965277777777778 | 0 |
| 0.7972222222222222 | 0 |
| 0.7979166666666666 | 0 |
| 0.7986111111111112 | 0 |
| 0.7993055555555556 | 0 |
| 0.7999999999999999 | 0 |
| 0.8006944444444444 | 0 |
| 0.8013888888888889 | 0 |
| 0.8020833333333334 | 0 |
| 0.8027777777777777 | 0 |
| 0.8034722222222223 | 0 |
| 0.8041666666666667 | 0 |
| 0.8048611111111111 | 0 |
| 0.8055555555555555 | 0 |
| 0.80625 | 0 |
| 0.8069444444444445 | 0 |
| 0.8076388888888889 | 0 |
| 0.8083333333333332 | 0 |
| 0.8090277777777778 | 0 |
| 0.8097222222222222 | 0 |
| 0.8104166666666667 | 0 |
| 0.811111111111111 | 0 |
| 0.8118055555555556 | 0 |
| 0.8125 | 0 |
| 0.8131944444444444 | 0 |
| 0.813888888888889 | 0 |
| 0.8145833333333333 | 0 |
| 0.8152777777777778 | 0 |
| 0.8159722222222222 | 0 |
| 0.8166666666666668 | 0 |
| 0.8173611111111111 | 0 |
| 0.8180555555555555 | 0 |
| 0.81875 | 0 |
| 0.8194444444444445 | 0 |
| 0.8201388888888889 | 0 |
| 0.8208333333333333 | 0 |
| 0.8215277777777777 | 0 |
| 0.8222222222222223 | 0 |
| 0.8229166666666666 | 0 |
| 0.8236111111111111 | 0 |
| 0.8243055555555556 | 0 |
| 0.8250000000000001 | 0 |
| 0.8256944444444444 | 0 |
| 0.8263888888888888 | 0 |
| 0.8270833333333334 | 0 |
| 0.8277777777777778 | 0 |
| 0.8284722222222222 | 0 |
| 0.8291666666666666 | 0 |
| 0.8298611111111112 | 0 |
| 0.8305555555555556 | 0 |
| 0.8312499999999999 | 0 |
| 0.8319444444444444 | 0 |
| 0.8326388888888889 | 0 |
| 0.8333333333333334 | 0 |
| 0.8340277777777777 | 0 |
| 0.8347222222222223 | 0 |
| 0.8354166666666667 | 0 |
| 0.8361111111111111 | 0 |
| 0.8368055555555555 | 0 |
| 0.8375 | 0 |
| 0.8381944444444445 | 0 |
| 0.8388888888888889 | 0 |
| 0.8395833333333332 | 0 |
| 0.8402777777777778 | 0 |
| 0.8409722222222222 | 0 |
| 0.8416666666666667 | 0 |
| 0.842361111111111 | 0 |
| 0.8430555555555556 | 0 |
| 0.84375 | 0 |
| 0.8444444444444444 | 0 |
| 0.845138888888889 | 0 |
| 0.8458333333333333 | 0 |
| 0.8465277777777778 | 0 |
| 0.8472222222222222 | 0 |
| 0.8479166666666668 | 0 |
| 0.8486111111111111 | 0 |
| 0.8493055555555555 | 0 |
| 0.85 | 0 |
| 0.8506944444444445 | 0 |
| 0.8513888888888889 | 0 |
| 0.8520833333333333 | 0 |
| 0.8527777777777777 | 0 |
| 0.8534722222222223 | 0 |
| 0.8541666666666666 | 0 |
| 0.8548611111111111 | 0 |
| 0.8555555555555556 | 0 |
| 0.8562500000000001 | 0 |
| 0.8569444444444444 | 0 |
| 0.8576388888888888 | 0 |
| 0.8583333333333334 | 0 |
| 0.8590277777777778 | 0 |
| 0.8597222222222222 | 0 |
| 0.8604166666666666 | 0 |
| 0.8611111111111112 | 0 |
| 0.8618055555555556 | 0 |
| 0.8624999999999999 | 0 |
| 0.8631944444444444 | 0 |
| 0.8638888888888889 | 0 |
| 0.8645833333333334 | 0 |
| 0.8652777777777777 | 0 |
| 0.8659722222222223 | 0 |
| 0.8666666666666667 | 0 |
| 0.8673611111111111 | 0 |
| 0.8680555555555555 | 0 |
| 0.86875 | 0 |
| 0.8694444444444445 | 0 |
| 0.8701388888888889 | 0 |
| 0.8708333333333332 | 0 |
| 0.8715277777777778 | 0 |
| 0.8722222222222222 | 0 |
| 0.8729166666666667 | 0 |
| 0.873611111111111 | 0 |
| 0.8743055555555556 | 0 |
| 0.875 | 0 |
| 0.8756944444444444 | 0 |
| 0.876388888888889 | 0 |
| 0.8770833333333333 | 0 |
| 0.8777777777777778 | 0 |
| 0.8784722222222222 | 0 |
| 0.8791666666666668 | 0 |
| 0.8798611111111111 | 0 |
| 0.8805555555555555 | 0 |
| 0.88125 | 0 |
| 0.8819444444444445 | 0 |
| 0.8826388888888889 | 0 |
| 0.8833333333333333 | 0 |
| 0.8840277777777777 | 0 |
| 0.8847222222222223 | 0 |
| 0.8854166666666666 | 0 |
| 0.8861111111111111 | 0 |
| 0.8868055555555556 | 0 |
| 0.8875000000000001 | 0 |
| 0.8881944444444444 | 0 |
| 0.8888888888888888 | 0 |
| 0.8895833333333334 | 0 |
| 0.8902777777777778 | 0 |
| 0.8909722222222222 | 0 |
| 0.8916666666666666 | 0 |
| 0.8923611111111112 | 0 |
| 0.8930555555555556 | 0 |
| 0.8937499999999999 | 0 |
| 0.8944444444444444 | 0 |
| 0.8951388888888889 | 0 |
| 0.8958333333333334 | 0 |
| 0.8965277777777777 | 0 |
| 0.8972222222222223 | 0 |
| 0.8979166666666667 | 0 |
| 0.8986111111111111 | 0 |
| 0.8993055555555555 | 0 |
| 0.9 | 0 |
| 0.9006944444444445 | 0 |
| 0.9013888888888889 | 0 |
| 0.9020833333333332 | 0 |
| 0.9027777777777778 | 0 |
| 0.9034722222222222 | 0 |
| 0.9041666666666667 | 0 |
| 0.904861111111111 | 0 |
| 0.9055555555555556 | 0 |
| 0.90625 | 0 |
| 0.9069444444444444 | 0 |
| 0.907638888888889 | 0 |
| 0.9083333333333333 | 0 |
| 0.9090277777777778 | 0 |
| 0.9097222222222222 | 0 |
| 0.9104166666666668 | 0 |
| 0.9111111111111111 | 0 |
| 0.9118055555555555 | 0 |
| 0.9125 | 0 |
| 0.9131944444444445 | 0 |
| 0.9138888888888889 | 0 |
| 0.9145833333333333 | 0 |
| 0.9152777777777777 | 0 |
| 0.9159722222222223 | 0 |
| 0.9166666666666666 | 0 |
| 0.9173611111111111 | 0 |
| 0.9180555555555556 | 0 |
| 0.9187500000000001 | 0 |
| 0.9194444444444444 | 0 |
| 0.9201388888888888 | 0 |
| 0.9208333333333334 | 0 |
| 0.9215277777777778 | 0 |
| 0.9222222222222222 | 0 |
| 0.9229166666666666 | 0 |
| 0.9236111111111112 | 0 |
| 0.9243055555555556 | 0 |
| 0.9249999999999999 | 0 |
| 0.9256944444444444 | 0 |
| 0.9263888888888889 | 0 |
| 0.9270833333333334 | 0 |
| 0.9277777777777777 | 0 |
| 0.9284722222222223 | 0 |
| 0.9291666666666667 | 0 |
| 0.9298611111111111 | 0 |
| 0.9305555555555555 | 0 |
| 0.93125 | 0 |
| 0.9319444444444445 | 0 |
| 0.9326388888888889 | 0 |
| 0.9333333333333332 | 0 |
| 0.9340277777777778 | 0 |
| 0.9347222222222222 | 0 |
| 0.9354166666666667 | 0 |
| 0.936111111111111 | 0 |
| 0.9368055555555556 | 0 |
| 0.9375 | 0 |
| 0.9381944444444444 | 0 |
| 0.938888888888889 | 0 |
| 0.9395833333333333 | 0 |
| 0.9402777777777778 | 0 |
| 0.9409722222222222 | 0 |
| 0.9416666666666668 | 0 |
| 0.9423611111111111 | 0 |
| 0.9430555555555555 | 0 |
| 0.94375 | 0 |
| 0.9444444444444445 | 0 |
| 0.9451388888888889 | 0 |
| 0.9458333333333333 | 0 |
| 0.9465277777777777 | 0 |
| 0.9472222222222223 | 0 |
| 0.9479166666666666 | 0 |
| 0.9486111111111111 | 0 |
| 0.9493055555555556 | 0 |
| 0.9500000000000001 | 0 |
| 0.9506944444444444 | 0 |
| 0.9513888888888888 | 0 |
| 0.9520833333333334 | 0 |
| 0.9527777777777778 | 0 |
| 0.9534722222222222 | 0 |
| 0.9541666666666666 | 0 |
| 0.9548611111111112 | 0 |
| 0.9555555555555556 | 0 |
| 0.9562499999999999 | 0 |
| 0.9569444444444444 | 0 |
| 0.9576388888888889 | 0 |
| 0.9583333333333334 | 0 |
| 0.9590277777777777 | 0 |
| 0.9597222222222223 | 0 |
| 0.9604166666666667 | 0 |
| 0.9611111111111111 | 0 |
| 0.9618055555555555 | 0 |
| 0.9625 | 0 |
| 0.9631944444444445 | 0 |
| 0.9638888888888889 | 0 |
| 0.9645833333333332 | 0 |
| 0.9652777777777778 | 0 |
| 0.9659722222222222 | 0 |
| 0.9666666666666667 | 0 |
| 0.967361111111111 | 0 |
| 0.9680555555555556 | 0 |
| 0.96875 | 0 |
| 0.9694444444444444 | 0 |
| 0.970138888888889 | 0 |
| 0.9708333333333333 | 0 |
| 0.9715277777777778 | 0 |
| 0.9722222222222222 | 0 |
| 0.9729166666666668 | 0 |
| 0.9736111111111111 | 0 |
| 0.9743055555555555 | 0 |
| 0.975 | 0 |
| 0.9756944444444445 | 0 |
| 0.9763888888888889 | 0 |
| 0.9770833333333333 | 0 |
| 0.9777777777777777 | 0 |
| 0.9784722222222223 | 0 |
| 0.9791666666666666 | 0 |
| 0.9798611111111111 | 0 |
| 0.9805555555555556 | 0 |
| 0.9812500000000001 | 0 |
| 0.9819444444444444 | 0 |
| 0.9826388888888888 | 0 |
| 0.9833333333333334 | 0 |
| 0.9840277777777778 | 0 |
| 0.9847222222222222 | 0 |
| 0.9854166666666666 | 0 |
| 0.9861111111111112 | 0 |
| 0.9868055555555556 | 0 |
| 0.9874999999999999 | 0 |
| 0.9881944444444444 | 0 |
| 0.9888888888888889 | 0 |
| 0.9895833333333334 | 0 |
| 0.9902777777777777 | 0 |
| 0.9909722222222223 | 0 |
| 0.9916666666666667 | 0 |
| 0.9923611111111111 | 0 |
| 0.9930555555555555 | 0 |
| 0.99375 | 0 |
| 0.9944444444444445 | 0 |
| 0.9951388888888889 | 0 |
| 0.9958333333333332 | 0 |
| 0.9965277777777778 | 0 |
| 0.9972222222222222 | 0 |
| 0.9979166666666667 | 0 |
| 0.998611111111111 | 0 |
| 0.9993055555555556 | 0 |